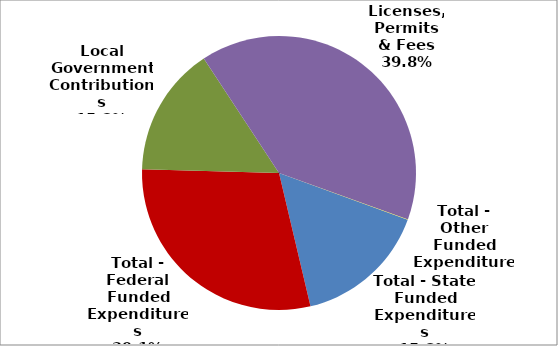
| Category | Series 0 |
|---|---|
| Total - State Funded Expenditures | 471364 |
| Total - Federal Funded Expenditures | 871772 |
| Local Government Contributions | 457819 |
| Licenses, Permits & Fees | 1189416 |
| Total - Other Funded Expenditures | 1440 |